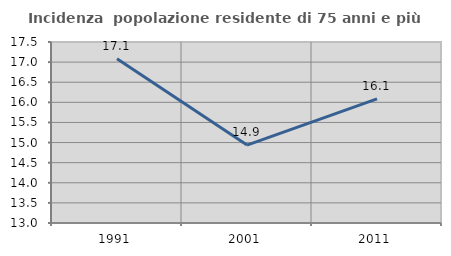
| Category | Incidenza  popolazione residente di 75 anni e più |
|---|---|
| 1991.0 | 17.083 |
| 2001.0 | 14.938 |
| 2011.0 | 16.084 |